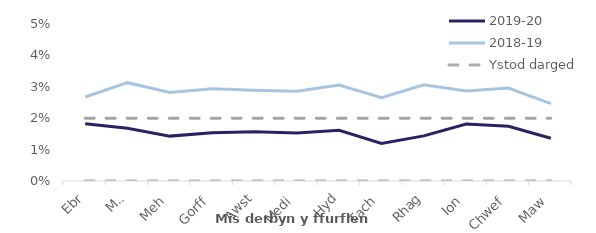
| Category | 2019-20 |
|---|---|
| Ebr | 0.018 |
| Mai | 0.017 |
| Meh | 0.014 |
| Gorff | 0.015 |
| Awst | 0.016 |
| Medi | 0.015 |
| Hyd | 0.016 |
| Tach | 0.012 |
| Rhag | 0.014 |
| Ion | 0.018 |
| Chwef | 0.017 |
| Maw | 0.014 |